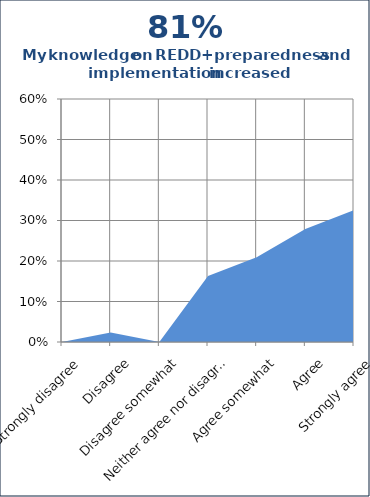
| Category | Series 1 |
|---|---|
| Strongly disagree | 0 |
| Disagree | 0.023 |
| Disagree somewhat | 0 |
| Neither agree nor disagree | 0.163 |
| Agree somewhat | 0.209 |
| Agree | 0.279 |
| Strongly agree | 0.326 |